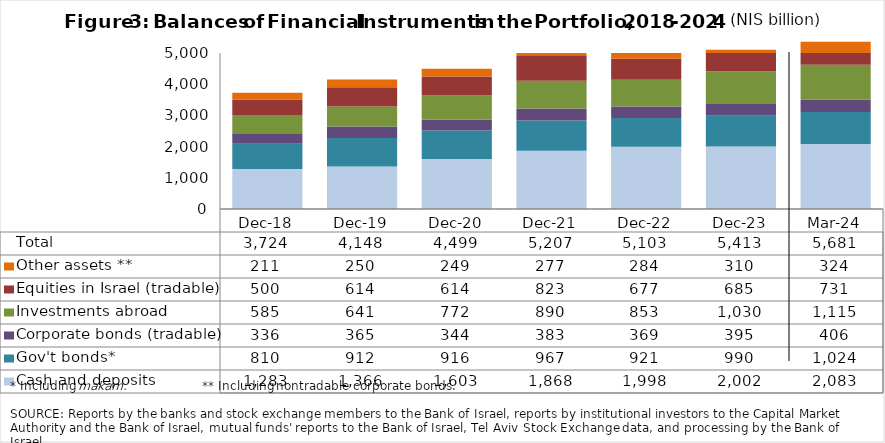
| Category | Cash and deposits | Gov't bonds* | Corporate bonds (tradable) | Investments abroad | Equities in Israel (tradable) | Other assets ** | Total |
|---|---|---|---|---|---|---|---|
| 2018-12-31 | 1283.26 | 809.81 | 335.75 | 584.7 | 499.59 | 211.19 | 3724.3 |
| 2019-12-31 | 1365.73 | 911.91 | 365.33 | 641.01 | 614.38 | 249.97 | 4148.33 |
| 2020-12-31 | 1603.4 | 916.09 | 344.34 | 772.48 | 613.6 | 248.61 | 4498.52 |
| 2021-12-31 | 1867.92 | 967.44 | 383.05 | 889.69 | 822.75 | 276.62 | 5207.47 |
| 2022-12-31 | 1998.01 | 920.92 | 368.98 | 853.14 | 677.21 | 284.29 | 5102.55 |
| 2023-12-31 | 2002.3 | 990.08 | 395.22 | 1029.82 | 685.3 | 310.02 | 5412.74 |
| 2024-03-31 | 2082.79 | 1023.58 | 405.79 | 1114.6 | 731 | 323.68 | 5681.44 |